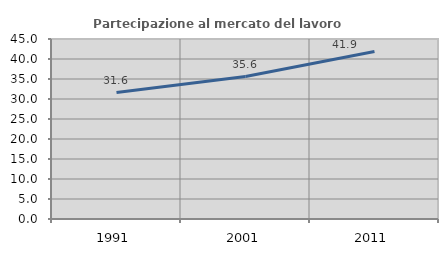
| Category | Partecipazione al mercato del lavoro  femminile |
|---|---|
| 1991.0 | 31.6 |
| 2001.0 | 35.603 |
| 2011.0 | 41.897 |